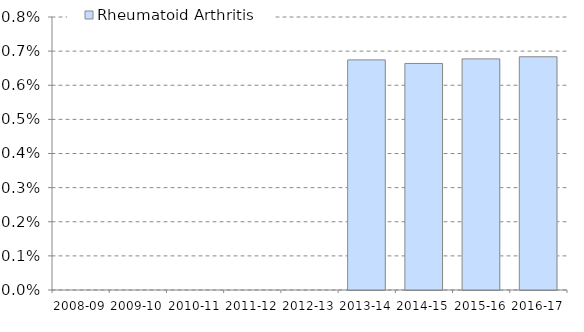
| Category | Rheumatoid Arthritis |
|---|---|
| 2008-09 | 0 |
| 2009-10 | 0 |
| 2010-11 | 0 |
| 2011-12 | 0 |
| 2012-13 | 0 |
| 2013-14 | 0.007 |
| 2014-15 | 0.007 |
| 2015-16 | 0.007 |
| 2016-17 | 0.007 |